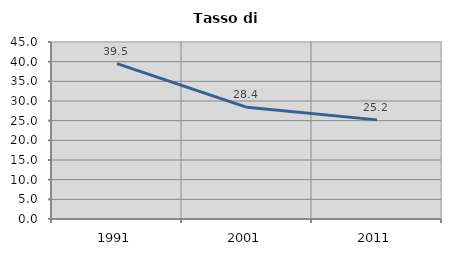
| Category | Tasso di disoccupazione   |
|---|---|
| 1991.0 | 39.52 |
| 2001.0 | 28.393 |
| 2011.0 | 25.203 |